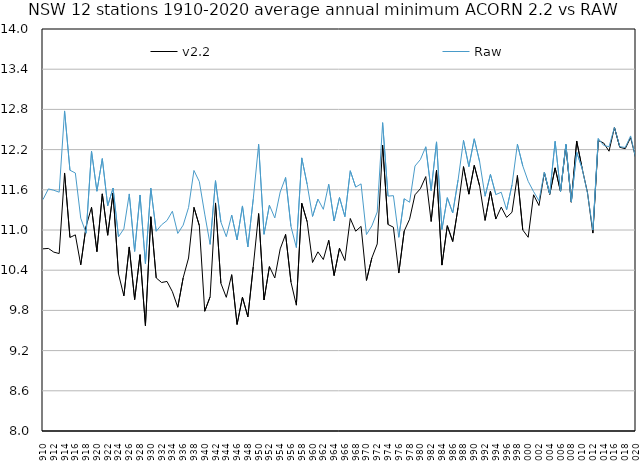
| Category | v2.2 | Raw |
|---|---|---|
| 1910 | 10.719 | 11.455 |
| 1911 | 10.725 | 11.613 |
| 1912 | 10.67 | 11.593 |
| 1913 | 10.648 | 11.565 |
| 1914 | 11.851 | 12.777 |
| 1915 | 10.889 | 11.892 |
| 1916 | 10.928 | 11.851 |
| 1917 | 10.48 | 11.177 |
| 1918 | 11.056 | 10.952 |
| 1919 | 11.339 | 12.176 |
| 1920 | 10.677 | 11.579 |
| 1921 | 11.54 | 12.066 |
| 1922 | 10.921 | 11.361 |
| 1923 | 11.553 | 11.627 |
| 1924 | 10.345 | 10.898 |
| 1925 | 10.017 | 11.018 |
| 1926 | 10.747 | 11.538 |
| 1927 | 9.961 | 10.681 |
| 1928 | 10.632 | 11.523 |
| 1929 | 9.572 | 10.499 |
| 1930 | 11.198 | 11.624 |
| 1931 | 10.285 | 10.981 |
| 1932 | 10.216 | 11.078 |
| 1933 | 10.232 | 11.142 |
| 1934 | 10.08 | 11.28 |
| 1935 | 9.847 | 10.949 |
| 1936 | 10.286 | 11.072 |
| 1937 | 10.582 | 11.336 |
| 1938 | 11.339 | 11.889 |
| 1939 | 11.065 | 11.722 |
| 1940 | 9.787 | 11.238 |
| 1941 | 10.004 | 10.786 |
| 1942 | 11.404 | 11.736 |
| 1943 | 10.204 | 11.118 |
| 1944 | 9.995 | 10.9 |
| 1945 | 10.333 | 11.223 |
| 1946 | 9.59 | 10.853 |
| 1947 | 9.996 | 11.359 |
| 1948 | 9.704 | 10.747 |
| 1949 | 10.451 | 11.46 |
| 1950 | 11.245 | 12.28 |
| 1951 | 9.955 | 10.936 |
| 1952 | 10.454 | 11.37 |
| 1953 | 10.284 | 11.18 |
| 1954 | 10.718 | 11.566 |
| 1955 | 10.935 | 11.784 |
| 1956 | 10.222 | 11.052 |
| 1957 | 9.878 | 10.738 |
| 1958 | 11.399 | 12.076 |
| 1959 | 11.124 | 11.682 |
| 1960 | 10.515 | 11.202 |
| 1961 | 10.674 | 11.461 |
| 1962 | 10.559 | 11.308 |
| 1963 | 10.846 | 11.683 |
| 1964 | 10.32 | 11.134 |
| 1965 | 10.729 | 11.485 |
| 1966 | 10.544 | 11.2 |
| 1967 | 11.172 | 11.884 |
| 1968 | 10.982 | 11.64 |
| 1969 | 11.054 | 11.689 |
| 1970 | 10.247 | 10.932 |
| 1971 | 10.583 | 11.061 |
| 1972 | 10.792 | 11.269 |
| 1973 | 12.268 | 12.603 |
| 1974 | 11.082 | 11.506 |
| 1975 | 11.041 | 11.513 |
| 1976 | 10.358 | 10.891 |
| 1977 | 10.984 | 11.467 |
| 1978 | 11.161 | 11.414 |
| 1979 | 11.525 | 11.955 |
| 1980 | 11.616 | 12.051 |
| 1981 | 11.797 | 12.242 |
| 1982 | 11.127 | 11.588 |
| 1983 | 11.892 | 12.315 |
| 1984 | 10.476 | 11.008 |
| 1985 | 11.064 | 11.482 |
| 1986 | 10.829 | 11.254 |
| 1987 | 11.336 | 11.747 |
| 1988 | 11.946 | 12.338 |
| 1989 | 11.535 | 11.947 |
| 1990 | 11.964 | 12.361 |
| 1991 | 11.654 | 12.017 |
| 1992 | 11.143 | 11.504 |
| 1993 | 11.579 | 11.83 |
| 1994 | 11.164 | 11.529 |
| 1995 | 11.341 | 11.564 |
| 1996 | 11.189 | 11.303 |
| 1997 | 11.265 | 11.672 |
| 1998 | 11.813 | 12.281 |
| 1999 | 11 | 11.956 |
| 2000 | 10.891 | 11.727 |
| 2001 | 11.526 | 11.573 |
| 2002 | 11.366 | 11.437 |
| 2003 | 11.856 | 11.865 |
| 2004 | 11.533 | 11.539 |
| 2005 | 11.928 | 12.323 |
| 2006 | 11.575 | 11.572 |
| 2007 | 12.267 | 12.284 |
| 2008 | 11.415 | 11.421 |
| 2009 | 12.328 | 12.162 |
| 2010 | 11.922 | 11.919 |
| 2011 | 11.559 | 11.551 |
| 2012 | 10.954 | 10.999 |
| 2013 | 12.335 | 12.366 |
| 2014 | 12.299 | 12.263 |
| 2015 | 12.176 | 12.243 |
| 2016 | 12.53 | 12.531 |
| 2017 | 12.235 | 12.244 |
| 2018 | 12.213 | 12.232 |
| 2019 | 12.379 | 12.404 |
| 2020 | 12.058 | 12.055 |